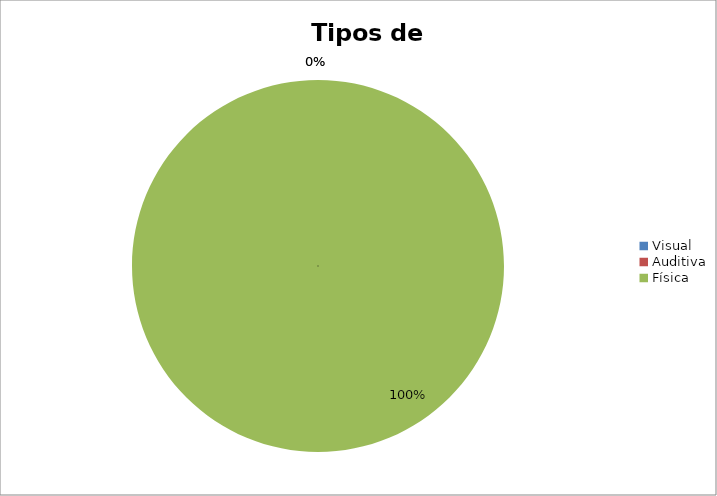
| Category | Quantitativo |
|---|---|
| Visual | 0 |
| Auditiva | 0 |
| Física | 1 |